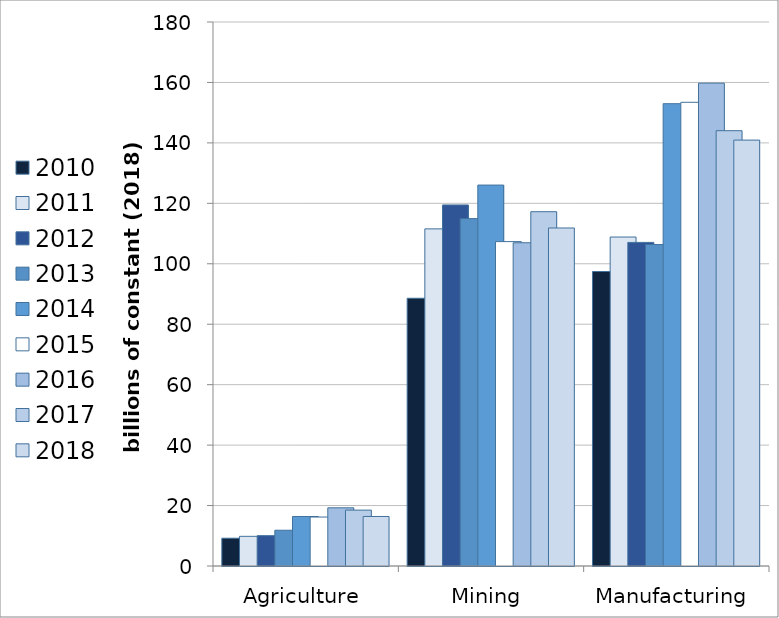
| Category | 2010 | 2011 | 2012 | 2013 | 2014 | 2015 | 2016 | 2017 | 2018 |
|---|---|---|---|---|---|---|---|---|---|
| Agriculture | 9.188 | 9.816 | 10.033 | 11.83 | 16.379 | 16.199 | 19.248 | 18.488 | 16.386 |
| Mining | 88.592 | 111.552 | 119.466 | 114.949 | 126.045 | 107.337 | 106.956 | 117.229 | 111.847 |
| Manufacturing | 97.443 | 108.853 | 107.075 | 106.359 | 152.966 | 153.435 | 159.76 | 144.034 | 140.923 |